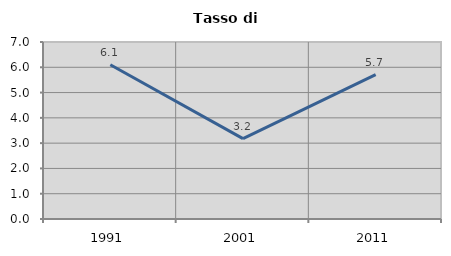
| Category | Tasso di disoccupazione   |
|---|---|
| 1991.0 | 6.102 |
| 2001.0 | 3.179 |
| 2011.0 | 5.708 |